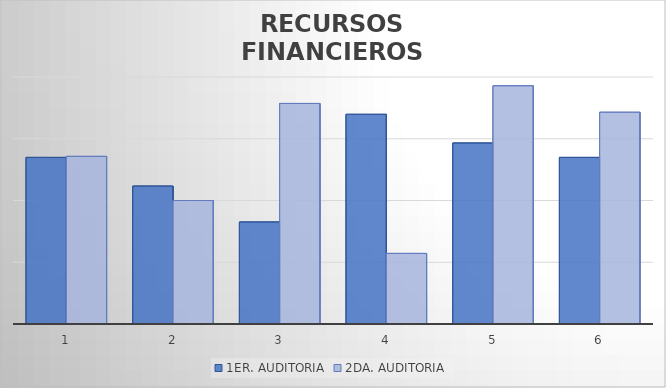
| Category | 1ER. AUDITORIA | 2DA. AUDITORIA |
|---|---|---|
| 0 | 4.14 | 4.143 |
| 1 | 4.047 | 4 |
| 2 | 3.93 | 4.314 |
| 3 | 4.279 | 3.829 |
| 4 | 4.186 | 4.371 |
| 5 | 4.14 | 4.286 |